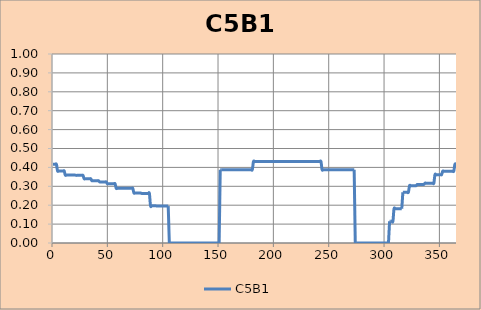
| Category | C5B1 |
|---|---|
| 1.0 | 0.416 |
| 2.0 | 0.416 |
| 3.0 | 0.416 |
| 4.0 | 0.416 |
| 5.0 | 0.381 |
| 6.0 | 0.381 |
| 7.0 | 0.381 |
| 8.0 | 0.381 |
| 9.0 | 0.381 |
| 10.0 | 0.381 |
| 11.0 | 0.381 |
| 12.0 | 0.359 |
| 13.0 | 0.359 |
| 14.0 | 0.359 |
| 15.0 | 0.359 |
| 16.0 | 0.359 |
| 17.0 | 0.359 |
| 18.0 | 0.359 |
| 19.0 | 0.359 |
| 20.0 | 0.359 |
| 21.0 | 0.359 |
| 22.0 | 0.358 |
| 23.0 | 0.358 |
| 24.0 | 0.358 |
| 25.0 | 0.358 |
| 26.0 | 0.358 |
| 27.0 | 0.358 |
| 28.0 | 0.358 |
| 29.0 | 0.34 |
| 30.0 | 0.34 |
| 31.0 | 0.34 |
| 32.0 | 0.34 |
| 33.0 | 0.34 |
| 34.0 | 0.34 |
| 35.0 | 0.34 |
| 36.0 | 0.33 |
| 37.0 | 0.33 |
| 38.0 | 0.33 |
| 39.0 | 0.33 |
| 40.0 | 0.33 |
| 41.0 | 0.33 |
| 42.0 | 0.33 |
| 43.0 | 0.323 |
| 44.0 | 0.323 |
| 45.0 | 0.323 |
| 46.0 | 0.323 |
| 47.0 | 0.323 |
| 48.0 | 0.323 |
| 49.0 | 0.323 |
| 50.0 | 0.314 |
| 51.0 | 0.314 |
| 52.0 | 0.314 |
| 53.0 | 0.314 |
| 54.0 | 0.314 |
| 55.0 | 0.314 |
| 56.0 | 0.314 |
| 57.0 | 0.314 |
| 58.0 | 0.289 |
| 59.0 | 0.289 |
| 60.0 | 0.289 |
| 61.0 | 0.289 |
| 62.0 | 0.289 |
| 63.0 | 0.289 |
| 64.0 | 0.289 |
| 65.0 | 0.289 |
| 66.0 | 0.289 |
| 67.0 | 0.289 |
| 68.0 | 0.289 |
| 69.0 | 0.289 |
| 70.0 | 0.289 |
| 71.0 | 0.289 |
| 72.0 | 0.289 |
| 73.0 | 0.289 |
| 74.0 | 0.265 |
| 75.0 | 0.265 |
| 76.0 | 0.265 |
| 77.0 | 0.265 |
| 78.0 | 0.265 |
| 79.0 | 0.265 |
| 80.0 | 0.265 |
| 81.0 | 0.262 |
| 82.0 | 0.262 |
| 83.0 | 0.262 |
| 84.0 | 0.262 |
| 85.0 | 0.262 |
| 86.0 | 0.262 |
| 87.0 | 0.262 |
| 88.0 | 0.262 |
| 89.0 | 0.197 |
| 90.0 | 0.197 |
| 91.0 | 0.197 |
| 92.0 | 0.197 |
| 93.0 | 0.197 |
| 94.0 | 0.197 |
| 95.0 | 0.195 |
| 96.0 | 0.195 |
| 97.0 | 0.195 |
| 98.0 | 0.195 |
| 99.0 | 0.195 |
| 100.0 | 0.195 |
| 101.0 | 0.195 |
| 102.0 | 0.195 |
| 103.0 | 0.195 |
| 104.0 | 0.195 |
| 105.0 | 0.195 |
| 106.0 | 0 |
| 107.0 | 0 |
| 108.0 | 0 |
| 109.0 | 0 |
| 110.0 | 0 |
| 111.0 | 0 |
| 112.0 | 0 |
| 113.0 | 0 |
| 114.0 | 0 |
| 115.0 | 0 |
| 116.0 | 0 |
| 117.0 | 0 |
| 118.0 | 0 |
| 119.0 | 0 |
| 120.0 | 0 |
| 121.0 | 0 |
| 122.0 | 0 |
| 123.0 | 0 |
| 124.0 | 0 |
| 125.0 | 0 |
| 126.0 | 0 |
| 127.0 | 0 |
| 128.0 | 0 |
| 129.0 | 0 |
| 130.0 | 0 |
| 131.0 | 0 |
| 132.0 | 0 |
| 133.0 | 0 |
| 134.0 | 0 |
| 135.0 | 0 |
| 136.0 | 0 |
| 137.0 | 0 |
| 138.0 | 0 |
| 139.0 | 0 |
| 140.0 | 0 |
| 141.0 | 0 |
| 142.0 | 0 |
| 143.0 | 0 |
| 144.0 | 0 |
| 145.0 | 0 |
| 146.0 | 0 |
| 147.0 | 0 |
| 148.0 | 0 |
| 149.0 | 0 |
| 150.0 | 0 |
| 151.0 | 0 |
| 152.0 | 0.388 |
| 153.0 | 0.388 |
| 154.0 | 0.388 |
| 155.0 | 0.388 |
| 156.0 | 0.388 |
| 157.0 | 0.388 |
| 158.0 | 0.388 |
| 159.0 | 0.388 |
| 160.0 | 0.388 |
| 161.0 | 0.388 |
| 162.0 | 0.388 |
| 163.0 | 0.388 |
| 164.0 | 0.388 |
| 165.0 | 0.388 |
| 166.0 | 0.388 |
| 167.0 | 0.388 |
| 168.0 | 0.388 |
| 169.0 | 0.388 |
| 170.0 | 0.388 |
| 171.0 | 0.388 |
| 172.0 | 0.388 |
| 173.0 | 0.388 |
| 174.0 | 0.388 |
| 175.0 | 0.388 |
| 176.0 | 0.388 |
| 177.0 | 0.388 |
| 178.0 | 0.388 |
| 179.0 | 0.388 |
| 180.0 | 0.388 |
| 181.0 | 0.388 |
| 182.0 | 0.431 |
| 183.0 | 0.431 |
| 184.0 | 0.431 |
| 185.0 | 0.431 |
| 186.0 | 0.431 |
| 187.0 | 0.431 |
| 188.0 | 0.431 |
| 189.0 | 0.431 |
| 190.0 | 0.431 |
| 191.0 | 0.431 |
| 192.0 | 0.431 |
| 193.0 | 0.431 |
| 194.0 | 0.431 |
| 195.0 | 0.431 |
| 196.0 | 0.431 |
| 197.0 | 0.431 |
| 198.0 | 0.431 |
| 199.0 | 0.431 |
| 200.0 | 0.431 |
| 201.0 | 0.431 |
| 202.0 | 0.431 |
| 203.0 | 0.431 |
| 204.0 | 0.431 |
| 205.0 | 0.431 |
| 206.0 | 0.431 |
| 207.0 | 0.431 |
| 208.0 | 0.431 |
| 209.0 | 0.431 |
| 210.0 | 0.431 |
| 211.0 | 0.431 |
| 212.0 | 0.431 |
| 213.0 | 0.431 |
| 214.0 | 0.431 |
| 215.0 | 0.431 |
| 216.0 | 0.431 |
| 217.0 | 0.431 |
| 218.0 | 0.431 |
| 219.0 | 0.431 |
| 220.0 | 0.431 |
| 221.0 | 0.431 |
| 222.0 | 0.431 |
| 223.0 | 0.431 |
| 224.0 | 0.431 |
| 225.0 | 0.431 |
| 226.0 | 0.431 |
| 227.0 | 0.431 |
| 228.0 | 0.431 |
| 229.0 | 0.431 |
| 230.0 | 0.431 |
| 231.0 | 0.431 |
| 232.0 | 0.431 |
| 233.0 | 0.431 |
| 234.0 | 0.431 |
| 235.0 | 0.431 |
| 236.0 | 0.431 |
| 237.0 | 0.431 |
| 238.0 | 0.431 |
| 239.0 | 0.431 |
| 240.0 | 0.431 |
| 241.0 | 0.431 |
| 242.0 | 0.431 |
| 243.0 | 0.431 |
| 244.0 | 0.388 |
| 245.0 | 0.388 |
| 246.0 | 0.388 |
| 247.0 | 0.388 |
| 248.0 | 0.388 |
| 249.0 | 0.388 |
| 250.0 | 0.388 |
| 251.0 | 0.388 |
| 252.0 | 0.388 |
| 253.0 | 0.388 |
| 254.0 | 0.388 |
| 255.0 | 0.388 |
| 256.0 | 0.388 |
| 257.0 | 0.388 |
| 258.0 | 0.388 |
| 259.0 | 0.388 |
| 260.0 | 0.388 |
| 261.0 | 0.388 |
| 262.0 | 0.388 |
| 263.0 | 0.388 |
| 264.0 | 0.388 |
| 265.0 | 0.388 |
| 266.0 | 0.388 |
| 267.0 | 0.388 |
| 268.0 | 0.388 |
| 269.0 | 0.388 |
| 270.0 | 0.388 |
| 271.0 | 0.388 |
| 272.0 | 0.388 |
| 273.0 | 0.388 |
| 274.0 | 0 |
| 275.0 | 0 |
| 276.0 | 0 |
| 277.0 | 0 |
| 278.0 | 0 |
| 279.0 | 0 |
| 280.0 | 0 |
| 281.0 | 0 |
| 282.0 | 0 |
| 283.0 | 0 |
| 284.0 | 0 |
| 285.0 | 0 |
| 286.0 | 0 |
| 287.0 | 0 |
| 288.0 | 0 |
| 289.0 | 0 |
| 290.0 | 0 |
| 291.0 | 0 |
| 292.0 | 0 |
| 293.0 | 0 |
| 294.0 | 0 |
| 295.0 | 0 |
| 296.0 | 0 |
| 297.0 | 0 |
| 298.0 | 0 |
| 299.0 | 0 |
| 300.0 | 0 |
| 301.0 | 0 |
| 302.0 | 0 |
| 303.0 | 0 |
| 304.0 | 0 |
| 305.0 | 0.115 |
| 306.0 | 0.115 |
| 307.0 | 0.115 |
| 308.0 | 0.115 |
| 309.0 | 0.181 |
| 310.0 | 0.181 |
| 311.0 | 0.181 |
| 312.0 | 0.181 |
| 313.0 | 0.181 |
| 314.0 | 0.181 |
| 315.0 | 0.181 |
| 316.0 | 0.181 |
| 317.0 | 0.269 |
| 318.0 | 0.269 |
| 319.0 | 0.269 |
| 320.0 | 0.269 |
| 321.0 | 0.269 |
| 322.0 | 0.269 |
| 323.0 | 0.303 |
| 324.0 | 0.303 |
| 325.0 | 0.303 |
| 326.0 | 0.303 |
| 327.0 | 0.303 |
| 328.0 | 0.303 |
| 329.0 | 0.303 |
| 330.0 | 0.31 |
| 331.0 | 0.31 |
| 332.0 | 0.31 |
| 333.0 | 0.31 |
| 334.0 | 0.31 |
| 335.0 | 0.31 |
| 336.0 | 0.31 |
| 337.0 | 0.317 |
| 338.0 | 0.317 |
| 339.0 | 0.317 |
| 340.0 | 0.317 |
| 341.0 | 0.317 |
| 342.0 | 0.317 |
| 343.0 | 0.317 |
| 344.0 | 0.317 |
| 345.0 | 0.317 |
| 346.0 | 0.362 |
| 347.0 | 0.362 |
| 348.0 | 0.362 |
| 349.0 | 0.362 |
| 350.0 | 0.362 |
| 351.0 | 0.362 |
| 352.0 | 0.362 |
| 353.0 | 0.38 |
| 354.0 | 0.38 |
| 355.0 | 0.38 |
| 356.0 | 0.38 |
| 357.0 | 0.38 |
| 358.0 | 0.38 |
| 359.0 | 0.38 |
| 360.0 | 0.38 |
| 361.0 | 0.38 |
| 362.0 | 0.38 |
| 363.0 | 0.38 |
| 364.0 | 0.416 |
| 365.0 | 0.416 |